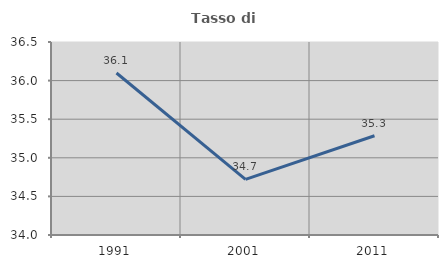
| Category | Tasso di occupazione   |
|---|---|
| 1991.0 | 36.099 |
| 2001.0 | 34.721 |
| 2011.0 | 35.285 |